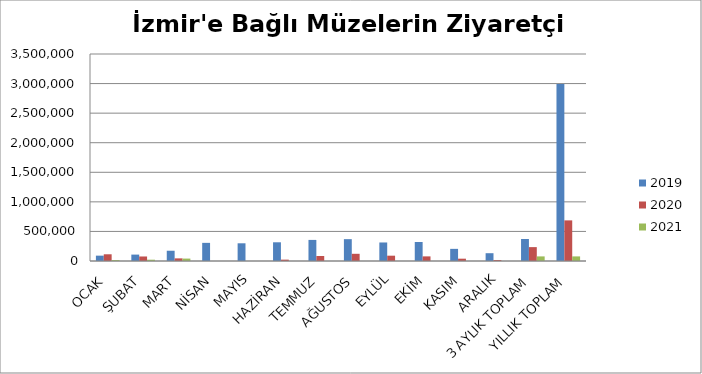
| Category | 2019 | 2020 | 2021 |
|---|---|---|---|
| OCAK | 90406 | 113675 | 14992 |
| ŞUBAT | 108321 | 76403 | 21877 |
| MART | 173542 | 44613 | 40903 |
| NİSAN | 306745 | 0 | 0 |
| MAYIS | 299441 | 0 | 0 |
| HAZİRAN | 316361 | 22885 | 0 |
| TEMMUZ | 356504 | 84548 | 0 |
| AĞUSTOS | 369370 | 121753 | 0 |
| EYLÜL | 313284 | 89757 | 0 |
| EKİM | 321498 | 78061 | 0 |
| KASIM | 205258 | 39134 | 0 |
| ARALIK | 131881 | 16010 | 0 |
| 3 AYLIK TOPLAM | 372269 | 234691 | 77772 |
| YILLIK TOPLAM | 2992611 | 686839 | 77772 |